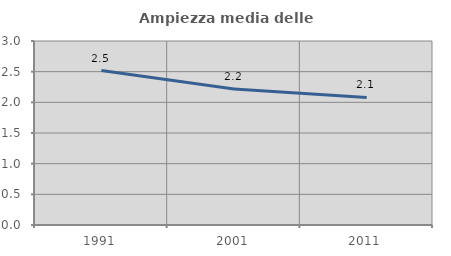
| Category | Ampiezza media delle famiglie |
|---|---|
| 1991.0 | 2.519 |
| 2001.0 | 2.218 |
| 2011.0 | 2.08 |